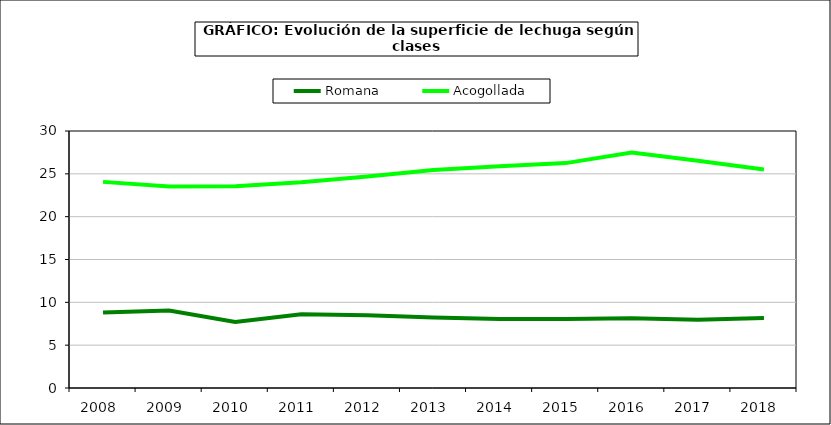
| Category | Romana | Acogollada |
|---|---|---|
| 2008.0 | 8.799 | 24.061 |
| 2009.0 | 9.045 | 23.512 |
| 2010.0 | 7.707 | 23.549 |
| 2011.0 | 8.605 | 24.015 |
| 2012.0 | 8.497 | 24.699 |
| 2013.0 | 8.23 | 25.438 |
| 2014.0 | 8.041 | 25.883 |
| 2015.0 | 8.063 | 26.251 |
| 2016.0 | 8.145 | 27.501 |
| 2017.0 | 7.972 | 26.536 |
| 2018.0 | 8.166 | 25.508 |